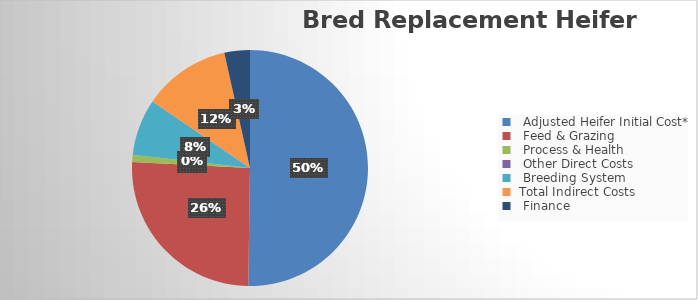
| Category | Series 0 |
|---|---|
|   Adjusted Heifer Initial Cost* | 732.741 |
|   Feed & Grazing  | 373.165 |
|   Process & Health | 14.205 |
|   Other Direct Costs | 0 |
|   Breeding System  | 112.781 |
|  Total Indirect Costs | 174.753 |
|   Finance | 51.013 |